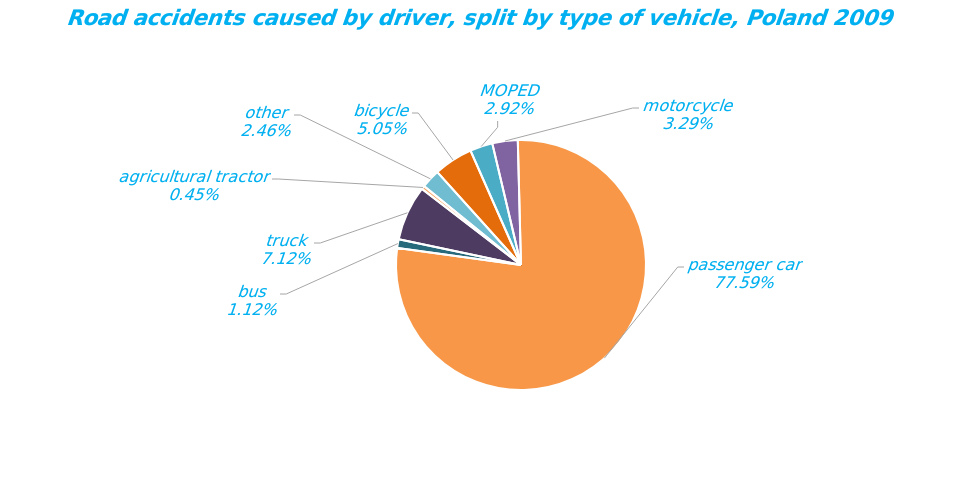
| Category | Series 0 |
|---|---|
| bicycle | 1770 |
| MOPED | 1024 |
| motorcycle | 1151 |
| passenger car | 27190 |
| bus | 394 |
| truck | 2495 |
| agricultural tractor | 159 |
| other | 861 |